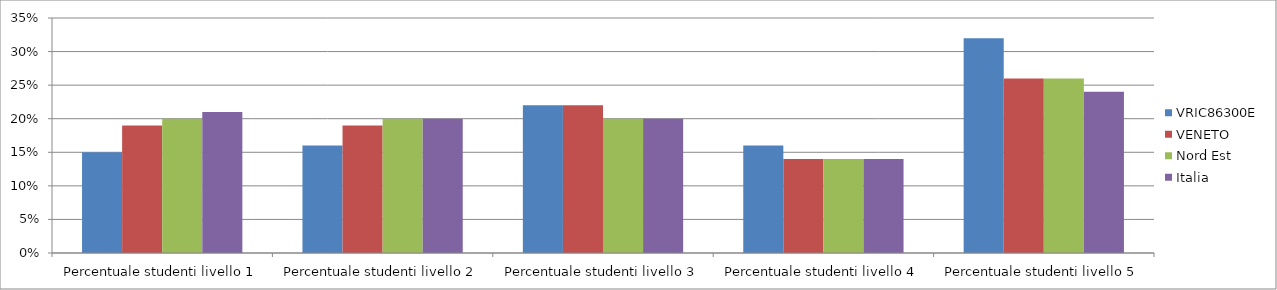
| Category | VRIC86300E | VENETO  | Nord Est | Italia |
|---|---|---|---|---|
| Percentuale studenti livello 1 | 0.15 | 0.19 | 0.2 | 0.21 |
| Percentuale studenti livello 2 | 0.16 | 0.19 | 0.2 | 0.2 |
| Percentuale studenti livello 3 | 0.22 | 0.22 | 0.2 | 0.2 |
| Percentuale studenti livello 4 | 0.16 | 0.14 | 0.14 | 0.14 |
| Percentuale studenti livello 5 | 0.32 | 0.26 | 0.26 | 0.24 |